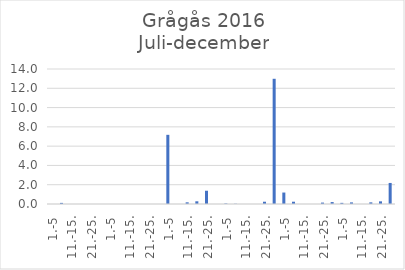
| Category | Series 0 |
|---|---|
| 1.-5 | 0 |
| 6.-10. | 0.116 |
| 11.-15. | 0 |
| 16.-20. | 0 |
| 21.-25. | 0 |
| 26.-31. | 0 |
| 1.-5 | 0 |
| 6.-10. | 0 |
| 11.-15. | 0 |
| 16.-20. | 0 |
| 21.-25. | 0 |
| 26.-31. | 0 |
| 1.-5 | 7.173 |
| 6.-10. | 0 |
| 11.-15. | 0.174 |
| 16.-20. | 0.28 |
| 21.-25. | 1.375 |
| 26.-30. | 0 |
| 1.-5 | 0.053 |
| 6.-10. | 0.024 |
| 11.-15. | 0 |
| 16.-20. | 0 |
| 21.-25. | 0.236 |
| 26.-31. | 12.985 |
| 1.-5 | 1.189 |
| 6.-10. | 0.237 |
| 11.-15. | 0 |
| 16.-20. | 0 |
| 21.-25. | 0.146 |
| 26.-30. | 0.2 |
| 1.-5 | 0.119 |
| 6.-10. | 0.167 |
| 11.-15. | 0 |
| 16.-20. | 0.171 |
| 21.-25. | 0.275 |
| 26.-31. | 2.183 |